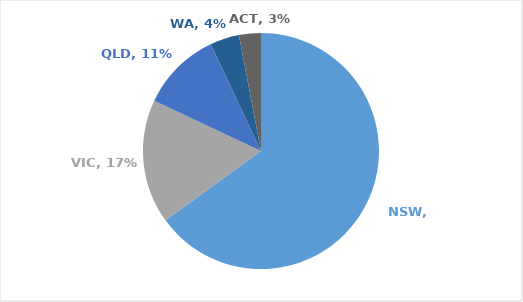
| Category | Series 0 |
|---|---|
| NSW | 0.65 |
| VIC | 0.17 |
| QLD | 0.11 |
| WA | 0.04 |
| ACT | 0.03 |